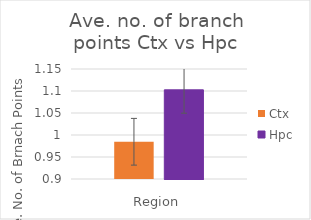
| Category | Ctx | Hpc |
|---|---|---|
| Total cells | 0.985 | 1.103 |